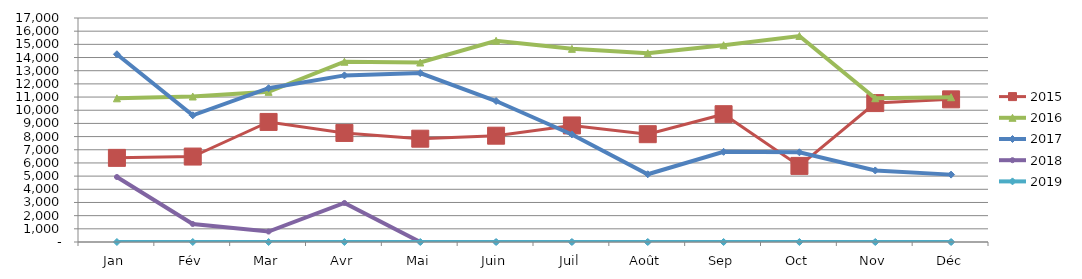
| Category | 2015 | 2016 | 2017 | 2018 | 2019 |
|---|---|---|---|---|---|
| Jan | 6384.87 | 10905.659 | 14248 | 4933.269 | 0 |
| Fév | 6484.125 | 11042.895 | 9616.688 | 1368.352 | 0 |
| Mar | 9112.029 | 11394.094 | 11673.172 | 792.204 | 0 |
| Avr | 8276.759 | 13679.646 | 12644.037 | 2962.183 | 0 |
| Mai | 7840.141 | 13621.538 | 12817.719 | 0 | 0 |
| Juin | 8067.942 | 15270.783 | 10698.801 | 0 | 0 |
| Juil | 8846.261 | 14659.952 | 8163.046 | 0 | 0 |
| Août | 8181.842 | 14323.994 | 5140.982 | 0 | 0 |
| Sep | 9699.665 | 14931.088 | 6843.064 | 0 | 0 |
| Oct | 5775.782 | 15635.989 | 6808 | 0 | 0 |
| Nov | 10542 | 10911.603 | 5430.223 | 0 | 0 |
| Déc | 10826.47 | 10988 | 5113.315 | 0 | 0 |